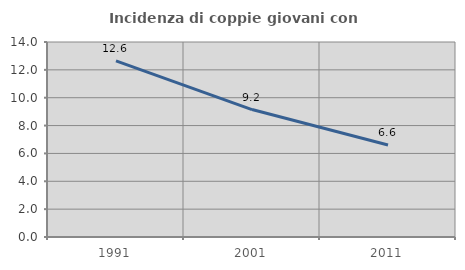
| Category | Incidenza di coppie giovani con figli |
|---|---|
| 1991.0 | 12.648 |
| 2001.0 | 9.151 |
| 2011.0 | 6.605 |